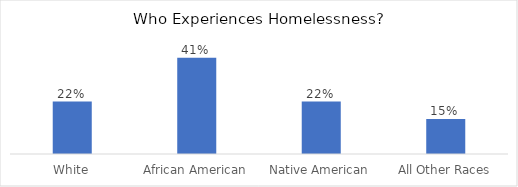
| Category | Series 0 |
|---|---|
| White | 0.222 |
| African American | 0.407 |
| Native American | 0.222 |
| All Other Races | 0.148 |